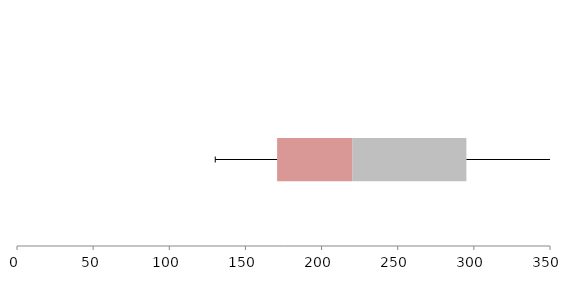
| Category | Series 1 | Series 2 | Series 3 |
|---|---|---|---|
| 0 | 170.806 | 49.559 | 74.74 |